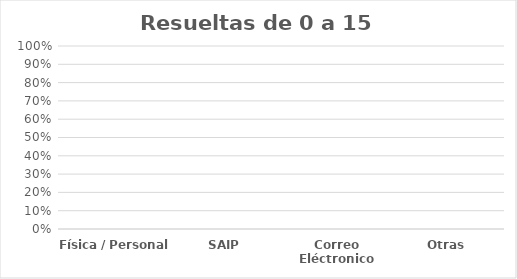
| Category | Series 0 |
|---|---|
| Física / Personal | 0 |
| SAIP | 0 |
| Correo Eléctronico | 0 |
| Otras | 0 |